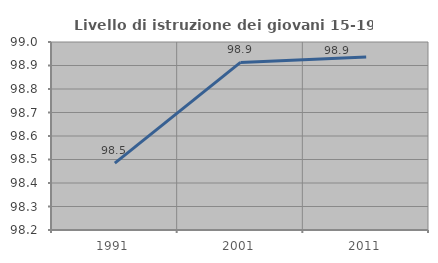
| Category | Livello di istruzione dei giovani 15-19 anni |
|---|---|
| 1991.0 | 98.485 |
| 2001.0 | 98.913 |
| 2011.0 | 98.936 |